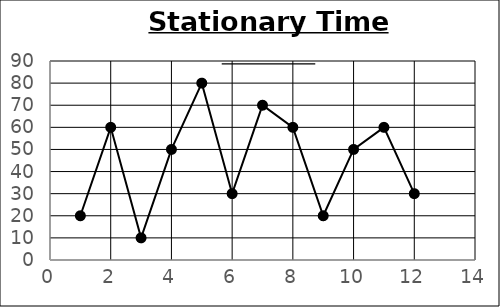
| Category | Sationary Time Series |
|---|---|
| 1.0 | 20 |
| 2.0 | 60 |
| 3.0 | 10 |
| 4.0 | 50 |
| 5.0 | 80 |
| 6.0 | 30 |
| 7.0 | 70 |
| 8.0 | 60 |
| 9.0 | 20 |
| 10.0 | 50 |
| 11.0 | 60 |
| 12.0 | 30 |